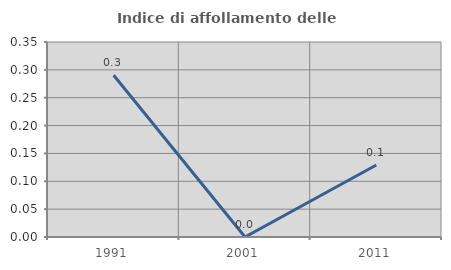
| Category | Indice di affollamento delle abitazioni  |
|---|---|
| 1991.0 | 0.29 |
| 2001.0 | 0 |
| 2011.0 | 0.129 |